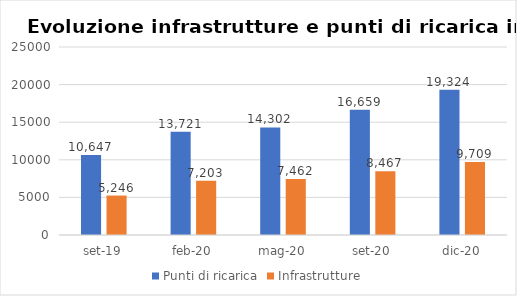
| Category | Punti di ricarica | Infrastrutture |
|---|---|---|
| set-19 | 10647 | 5246 |
| feb-20 | 13721.4 | 7203 |
| mag-20 | 14301.691 | 7461.9 |
| set-20 | 16659.405 | 8466.645 |
| dic-20 | 19323.6 | 9708.75 |